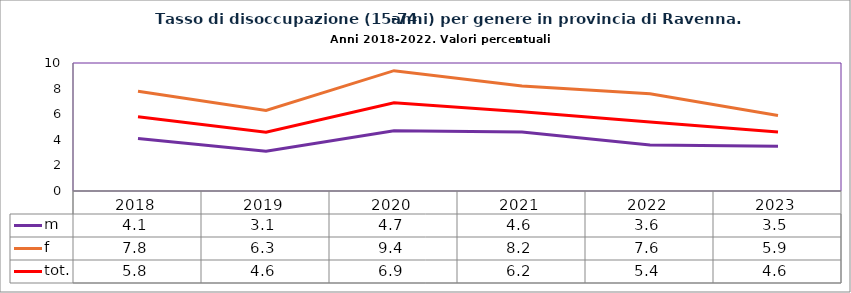
| Category | m | f | tot. |
|---|---|---|---|
| 2018.0 | 4.1 | 7.8 | 5.8 |
| 2019.0 | 3.1 | 6.3 | 4.6 |
| 2020.0 | 4.7 | 9.4 | 6.9 |
| 2021.0 | 4.6 | 8.2 | 6.2 |
| 2022.0 | 3.6 | 7.6 | 5.4 |
| 2023.0 | 3.5 | 5.9 | 4.6 |